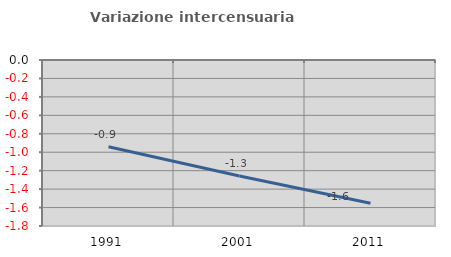
| Category | Variazione intercensuaria annua |
|---|---|
| 1991.0 | -0.941 |
| 2001.0 | -1.257 |
| 2011.0 | -1.554 |